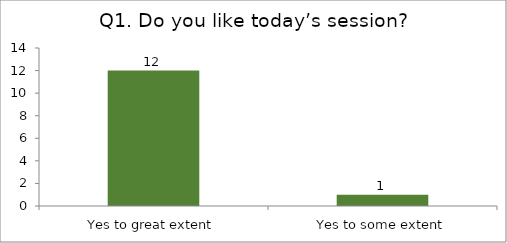
| Category | Q1. Do you like today’s session? |
|---|---|
| Yes to great extent | 12 |
| Yes to some extent | 1 |